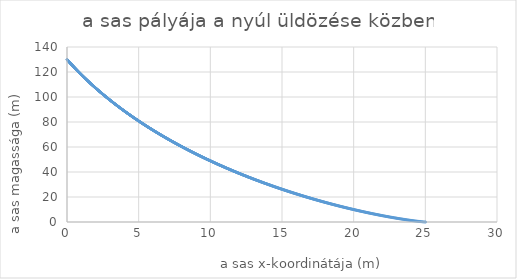
| Category | Series 0 |
|---|---|
| 0.006817466567532174 | 129.911 |
| 0.013641715062583354 | 129.823 |
| 0.020472749994992535 | 129.734 |
| 0.0273105758805344 | 129.645 |
| 0.03415519724093104 | 129.557 |
| 0.041006618603863676 | 129.468 |
| 0.04786484450298452 | 129.38 |
| 0.054729879477928525 | 129.291 |
| 0.06160172807432531 | 129.202 |
| 0.068480394843811 | 129.114 |
| 0.07536588434404017 | 129.025 |
| 0.0822582011386978 | 128.937 |
| 0.08915734979751126 | 128.848 |
| 0.09606333489626227 | 128.759 |
| 0.10297616101679902 | 128.671 |
| 0.1098958327470482 | 128.582 |
| 0.11682235468102714 | 128.493 |
| 0.12375573141885594 | 128.405 |
| 0.13069596756676966 | 128.316 |
| 0.13764306773713048 | 128.228 |
| 0.14459703654844 | 128.139 |
| 0.1515578786253515 | 128.05 |
| 0.1585255985986822 | 127.962 |
| 0.16550020110542568 | 127.873 |
| 0.17248169078876416 | 127.784 |
| 0.17947007229808098 | 127.696 |
| 0.18646535028897296 | 127.607 |
| 0.193467529423263 | 127.519 |
| 0.20047661436901243 | 127.43 |
| 0.20749260980053363 | 127.341 |
| 0.21451552039840266 | 127.253 |
| 0.22154535084947172 | 127.164 |
| 0.22858210584688188 | 127.076 |
| 0.23562579009007578 | 126.987 |
| 0.24267640828481032 | 126.898 |
| 0.2497339651431693 | 126.81 |
| 0.2567984653835764 | 126.721 |
| 0.26386991373080776 | 126.633 |
| 0.27094831491600496 | 126.544 |
| 0.2780336736766879 | 126.455 |
| 0.28512599475676775 | 126.367 |
| 0.2922252829065597 | 126.278 |
| 0.2993315428827962 | 126.19 |
| 0.3064447794486398 | 126.101 |
| 0.31356499737369636 | 126.012 |
| 0.320692201434028 | 125.924 |
| 0.32782639641216627 | 125.835 |
| 0.3349675870971253 | 125.747 |
| 0.34211577828441514 | 125.658 |
| 0.34927097477605473 | 125.569 |
| 0.35643318138058544 | 125.481 |
| 0.3636024029130841 | 125.392 |
| 0.37077864419517664 | 125.304 |
| 0.37796191005505125 | 125.215 |
| 0.38515220532747185 | 125.126 |
| 0.39234953485379165 | 125.038 |
| 0.39955390348196645 | 124.949 |
| 0.4067653160665683 | 124.861 |
| 0.41398377746879905 | 124.772 |
| 0.4212092925565039 | 124.683 |
| 0.4284418662041851 | 124.595 |
| 0.4356815032930155 | 124.506 |
| 0.4429282087108524 | 124.418 |
| 0.45018198735225134 | 124.329 |
| 0.45744284411847963 | 124.24 |
| 0.46471078391753046 | 124.152 |
| 0.4719858116641366 | 124.063 |
| 0.47926793227978437 | 123.975 |
| 0.48655715069272754 | 123.886 |
| 0.4938534718380013 | 123.797 |
| 0.5011569006574365 | 123.709 |
| 0.5084674420996731 | 123.62 |
| 0.5157851011201751 | 123.532 |
| 0.5231098826812438 | 123.443 |
| 0.530441791752033 | 123.354 |
| 0.5377808333085621 | 123.266 |
| 0.5451270123337312 | 123.177 |
| 0.552480333817335 | 123.089 |
| 0.5598408027560771 | 123 |
| 0.5672084241535845 | 122.912 |
| 0.5745832030204221 | 122.823 |
| 0.581965144374107 | 122.734 |
| 0.5893542532391228 | 122.646 |
| 0.5967505346469348 | 122.557 |
| 0.6041539936360037 | 122.469 |
| 0.6115646352518009 | 122.38 |
| 0.6189824645468228 | 122.291 |
| 0.6264074865806056 | 122.203 |
| 0.63383970641974 | 122.114 |
| 0.641279129137886 | 122.026 |
| 0.6487257598157877 | 121.937 |
| 0.6561796035412882 | 121.849 |
| 0.6636406654093446 | 121.76 |
| 0.6711089505220426 | 121.671 |
| 0.6785844639886117 | 121.583 |
| 0.6860672109254404 | 121.494 |
| 0.6935571964560912 | 121.406 |
| 0.701054425711315 | 121.317 |
| 0.7085589038290677 | 121.229 |
| 0.7160706359545239 | 121.14 |
| 0.7235896272400931 | 121.051 |
| 0.7311158828454346 | 120.963 |
| 0.7386494079374729 | 120.874 |
| 0.7461902076904132 | 120.786 |
| 0.7537382872857565 | 120.697 |
| 0.7612936519123154 | 120.609 |
| 0.7688563067662291 | 120.52 |
| 0.7764262570509798 | 120.431 |
| 0.7840035079774074 | 120.343 |
| 0.7915880647637256 | 120.254 |
| 0.7991799326355374 | 120.166 |
| 0.8067791168258511 | 120.077 |
| 0.8143856225750957 | 119.989 |
| 0.821999455131137 | 119.9 |
| 0.8296206197492931 | 119.812 |
| 0.8372491216923508 | 119.723 |
| 0.844884966230581 | 119.634 |
| 0.8525281586417551 | 119.546 |
| 0.8601787042111612 | 119.457 |
| 0.8678366082316192 | 119.369 |
| 0.8755018760034984 | 119.28 |
| 0.8831745128347321 | 119.192 |
| 0.8908545240408353 | 119.103 |
| 0.8985419149449199 | 119.015 |
| 0.9062366908777113 | 118.926 |
| 0.9139388571775652 | 118.837 |
| 0.9216484191904833 | 118.749 |
| 0.9293653822701305 | 118.66 |
| 0.9370897517778507 | 118.572 |
| 0.9448215330826838 | 118.483 |
| 0.9525607315613821 | 118.395 |
| 0.960307352598427 | 118.306 |
| 0.9680614015860458 | 118.218 |
| 0.9758228839242283 | 118.129 |
| 0.9835918050207436 | 118.04 |
| 0.991368170291157 | 117.952 |
| 0.9991519851588467 | 117.863 |
| 1.0069432550550212 | 117.775 |
| 1.014741985418736 | 117.686 |
| 1.0225481816969102 | 117.598 |
| 1.0303618493443443 | 117.509 |
| 1.038182993823737 | 117.421 |
| 1.0460116206057024 | 117.332 |
| 1.0538477351687872 | 117.244 |
| 1.061691342999488 | 117.155 |
| 1.0695424495922692 | 117.066 |
| 1.077401060449579 | 116.978 |
| 1.085267181081868 | 116.889 |
| 1.0931408170076065 | 116.801 |
| 1.101021973753302 | 116.712 |
| 1.1089106568535165 | 116.624 |
| 1.1168068718508846 | 116.535 |
| 1.1247106242961304 | 116.447 |
| 1.1326219197480862 | 116.358 |
| 1.1405407637737097 | 116.27 |
| 1.1484671619481022 | 116.181 |
| 1.156401119854526 | 116.093 |
| 1.1643426430844233 | 116.004 |
| 1.1722917372374326 | 115.915 |
| 1.1802484079214084 | 115.827 |
| 1.1882126607524386 | 115.738 |
| 1.1961845013548624 | 115.65 |
| 1.2041639353612892 | 115.561 |
| 1.2121509684126162 | 115.473 |
| 1.2201456061580471 | 115.384 |
| 1.2281478542551105 | 115.296 |
| 1.2361577183696781 | 115.207 |
| 1.2441752041759835 | 115.119 |
| 1.2522003173566403 | 115.03 |
| 1.260233063602661 | 114.942 |
| 1.2682734486134761 | 114.853 |
| 1.2763214780969516 | 114.765 |
| 1.284377157769409 | 114.676 |
| 1.2924404933556433 | 114.588 |
| 1.3005114905889426 | 114.499 |
| 1.308590155211106 | 114.411 |
| 1.3166764929724641 | 114.322 |
| 1.3247705096318962 | 114.233 |
| 1.332872210956851 | 114.145 |
| 1.3409816027233648 | 114.056 |
| 1.3490986907160811 | 113.968 |
| 1.35722348072827 | 113.879 |
| 1.365355978561847 | 113.791 |
| 1.3734961900273932 | 113.702 |
| 1.3816441209441739 | 113.614 |
| 1.3897997771401587 | 113.525 |
| 1.3979631644520407 | 113.437 |
| 1.4061342887252564 | 113.348 |
| 1.414313155814005 | 113.26 |
| 1.4224997715812686 | 113.171 |
| 1.430694141898832 | 113.083 |
| 1.438896272647302 | 112.994 |
| 1.4471061697161278 | 112.906 |
| 1.4553238390036212 | 112.817 |
| 1.4635492864169757 | 112.729 |
| 1.4717825178722876 | 112.64 |
| 1.480023539294576 | 112.552 |
| 1.4882723566178022 | 112.463 |
| 1.496528975784891 | 112.375 |
| 1.5047934027477503 | 112.286 |
| 1.5130656434672922 | 112.198 |
| 1.521345703913453 | 112.109 |
| 1.5296335900652138 | 112.021 |
| 1.537929307910621 | 111.932 |
| 1.5462328634468077 | 111.844 |
| 1.5545442626800128 | 111.755 |
| 1.5628635116256036 | 111.667 |
| 1.5711906163080953 | 111.578 |
| 1.5795255827611732 | 111.49 |
| 1.5878684170277122 | 111.401 |
| 1.596219125159799 | 111.313 |
| 1.6045777132187524 | 111.224 |
| 1.6129441872751453 | 111.136 |
| 1.6213185534088252 | 111.047 |
| 1.6297008177089358 | 110.959 |
| 1.6380909862739383 | 110.87 |
| 1.646489065211633 | 110.782 |
| 1.6548950606391806 | 110.693 |
| 1.6633089786831237 | 110.605 |
| 1.6717308254794088 | 110.516 |
| 1.6801606071734074 | 110.428 |
| 1.6885983299199385 | 110.339 |
| 1.6970439998832898 | 110.251 |
| 1.7054976232372399 | 110.162 |
| 1.7139592061650801 | 110.074 |
| 1.7224287548596366 | 109.985 |
| 1.7309062755232927 | 109.897 |
| 1.7393917743680103 | 109.808 |
| 1.7478852576153532 | 109.72 |
| 1.7563867314965083 | 109.631 |
| 1.764896202252309 | 109.543 |
| 1.7734136761332568 | 109.454 |
| 1.7819391593995444 | 109.366 |
| 1.790472658321078 | 109.278 |
| 1.7990141791774998 | 109.189 |
| 1.8075637282582113 | 109.101 |
| 1.8161213118623953 | 109.012 |
| 1.8246869362990394 | 108.924 |
| 1.833260607886959 | 108.835 |
| 1.8418423329548197 | 108.747 |
| 1.8504321178411607 | 108.658 |
| 1.8590299688944183 | 108.57 |
| 1.8676358924729484 | 108.481 |
| 1.8762498949450506 | 108.393 |
| 1.884871982688991 | 108.304 |
| 1.893502162093026 | 108.216 |
| 1.902140439555425 | 108.127 |
| 1.9107868214844959 | 108.039 |
| 1.919441314298606 | 107.95 |
| 1.9281039244262086 | 107.862 |
| 1.9367746583058647 | 107.774 |
| 1.945453522386268 | 107.685 |
| 1.9541405231262683 | 107.597 |
| 1.962835666994896 | 107.508 |
| 1.971538960471386 | 107.42 |
| 1.9802504100452016 | 107.331 |
| 1.9889700222160598 | 107.243 |
| 1.997697803493954 | 107.154 |
| 2.0064337603991804 | 107.066 |
| 2.01517789946236 | 106.977 |
| 2.0239302272244664 | 106.889 |
| 2.0326907502368474 | 106.8 |
| 2.041459475061252 | 106.712 |
| 2.0502364082698534 | 106.624 |
| 2.0590215564452756 | 106.535 |
| 2.067814926180617 | 106.447 |
| 2.076616524079476 | 106.358 |
| 2.085426356755976 | 106.27 |
| 2.0942444308347916 | 106.181 |
| 2.1030707529511727 | 106.093 |
| 2.11190532975097 | 106.004 |
| 2.1207481678906603 | 105.916 |
| 2.129599274037374 | 105.827 |
| 2.1384586548689173 | 105.739 |
| 2.1473263170738015 | 105.651 |
| 2.156202267351266 | 105.562 |
| 2.165086512411305 | 105.474 |
| 2.173979058974695 | 105.385 |
| 2.182879913773019 | 105.297 |
| 2.191789083548692 | 105.208 |
| 2.2007065750549906 | 105.12 |
| 2.2096323950560754 | 105.032 |
| 2.2185665503270195 | 104.943 |
| 2.227509047653835 | 104.855 |
| 2.2364598938334987 | 104.766 |
| 2.245419095673979 | 104.678 |
| 2.254386659994263 | 104.589 |
| 2.2633625936243833 | 104.501 |
| 2.272346903405444 | 104.412 |
| 2.2813395961896488 | 104.324 |
| 2.290340678840328 | 104.236 |
| 2.2993501582319644 | 104.147 |
| 2.308368041250222 | 104.059 |
| 2.317394334791973 | 103.97 |
| 2.3264290457653245 | 103.882 |
| 2.3354721810896466 | 103.793 |
| 2.3445237476956002 | 103.705 |
| 2.3535837525251644 | 103.617 |
| 2.362652202531664 | 103.528 |
| 2.3717291046797984 | 103.44 |
| 2.380814465945668 | 103.351 |
| 2.3899082933168034 | 103.263 |
| 2.399010593792194 | 103.174 |
| 2.4081213743823153 | 103.086 |
| 2.417240642109157 | 102.998 |
| 2.426368404006252 | 102.909 |
| 2.435504667118705 | 102.821 |
| 2.4446494385032214 | 102.732 |
| 2.4538027252281354 | 102.644 |
| 2.4629645343734388 | 102.556 |
| 2.47213487303081 | 102.467 |
| 2.4813137483036436 | 102.379 |
| 2.490501167307079 | 102.29 |
| 2.4996971371680297 | 102.202 |
| 2.508901665025212 | 102.113 |
| 2.5181147580291756 | 102.025 |
| 2.5273364233423323 | 101.937 |
| 2.536566668138985 | 101.848 |
| 2.5458054996053594 | 101.76 |
| 2.5550529249396314 | 101.671 |
| 2.564308951351959 | 101.583 |
| 2.5735735860645104 | 101.495 |
| 2.5828468363114956 | 101.406 |
| 2.592128709339196 | 101.318 |
| 2.6014192124059954 | 101.229 |
| 2.6107183527824085 | 101.141 |
| 2.6200261377511134 | 101.053 |
| 2.629342574606981 | 100.964 |
| 2.6386676706571066 | 100.876 |
| 2.64800143322084 | 100.787 |
| 2.6573438696298166 | 100.699 |
| 2.6666949872279884 | 100.611 |
| 2.6760547933716556 | 100.522 |
| 2.6854232954294965 | 100.434 |
| 2.6948005007826006 | 100.345 |
| 2.704186416824499 | 100.257 |
| 2.7135810509611953 | 100.169 |
| 2.7229844106111987 | 100.08 |
| 2.732396503205555 | 99.992 |
| 2.7418173361878786 | 99.904 |
| 2.7512469170143845 | 99.815 |
| 2.7606852531539197 | 99.727 |
| 2.7701323520879964 | 99.638 |
| 2.7795882213108234 | 99.55 |
| 2.78905286832934 | 99.462 |
| 2.798526300663246 | 99.373 |
| 2.808008525845038 | 99.285 |
| 2.8174995514200374 | 99.196 |
| 2.8269993849464274 | 99.108 |
| 2.836508033995284 | 99.02 |
| 2.8460255061506095 | 98.931 |
| 2.855551809009365 | 98.843 |
| 2.8650869501815057 | 98.755 |
| 2.8746309372900116 | 98.666 |
| 2.884183777970923 | 98.578 |
| 2.8937454798733735 | 98.489 |
| 2.903316050659624 | 98.401 |
| 2.9128954980050956 | 98.313 |
| 2.9224838295984057 | 98.224 |
| 2.9320810531414 | 98.136 |
| 2.9416871763491867 | 98.048 |
| 2.9513022069501735 | 97.959 |
| 2.960926152686099 | 97.871 |
| 2.970559021312069 | 97.782 |
| 2.9802008205965906 | 97.694 |
| 2.9898515583216074 | 97.606 |
| 2.9995112422825336 | 97.517 |
| 3.0091798802882908 | 97.429 |
| 3.0188574801613415 | 97.341 |
| 3.0285440497377247 | 97.252 |
| 3.038239596867092 | 97.164 |
| 3.0479441294127434 | 97.076 |
| 3.0576576552516617 | 96.987 |
| 3.0673801822745492 | 96.899 |
| 3.0771117183858636 | 96.811 |
| 3.086852271503854 | 96.722 |
| 3.096601849560597 | 96.634 |
| 3.1063604605020334 | 96.545 |
| 3.1161281122880036 | 96.457 |
| 3.125904812892285 | 96.369 |
| 3.135690570302629 | 96.28 |
| 3.1454853925207975 | 96.192 |
| 3.1552892875625993 | 96.104 |
| 3.1651022634579284 | 96.015 |
| 3.1749243282507997 | 95.927 |
| 3.1847554899993877 | 95.839 |
| 3.1945957567760632 | 95.75 |
| 3.2044451366674314 | 95.662 |
| 3.214303637774369 | 95.574 |
| 3.2241712682120633 | 95.485 |
| 3.2340480361100488 | 95.397 |
| 3.2439339496122463 | 95.309 |
| 3.2538290168770008 | 95.22 |
| 3.2637332460771193 | 95.132 |
| 3.2736466453999116 | 95.044 |
| 3.2835692230472264 | 94.955 |
| 3.2935009872354915 | 94.867 |
| 3.3034419461957527 | 94.779 |
| 3.3133921081737125 | 94.69 |
| 3.32335148142977 | 94.602 |
| 3.3333200742390594 | 94.514 |
| 3.34329789489149 | 94.425 |
| 3.3532849516917866 | 94.337 |
| 3.363281252959528 | 94.249 |
| 3.373286807029188 | 94.16 |
| 3.3833016222501753 | 94.072 |
| 3.393325706986873 | 93.984 |
| 3.40335906961868 | 93.895 |
| 3.4134017185400514 | 93.807 |
| 3.4234536621605383 | 93.719 |
| 3.43351490890483 | 93.63 |
| 3.4435854672127935 | 93.542 |
| 3.4536653455395165 | 93.454 |
| 3.463754552355347 | 93.365 |
| 3.4738530961459353 | 93.277 |
| 3.4839609854122755 | 93.189 |
| 3.494078228670748 | 93.101 |
| 3.5042048344531604 | 93.012 |
| 3.5143408113067895 | 92.924 |
| 3.524486167794425 | 92.836 |
| 3.53464091249441 | 92.747 |
| 3.5448050540006837 | 92.659 |
| 3.5549786009228264 | 92.571 |
| 3.5651615618860992 | 92.482 |
| 3.5753539455314884 | 92.394 |
| 3.5855557605157493 | 92.306 |
| 3.595767015511448 | 92.217 |
| 3.6059877192070062 | 92.129 |
| 3.616217880306744 | 92.041 |
| 3.626457507530924 | 91.953 |
| 3.636706609615795 | 91.864 |
| 3.6469651953136357 | 91.776 |
| 3.6572332733928006 | 91.688 |
| 3.667510852637762 | 91.599 |
| 3.6777979418491578 | 91.511 |
| 3.688094549843832 | 91.423 |
| 3.698400685454883 | 91.335 |
| 3.7087163575317086 | 91.246 |
| 3.7190415749400487 | 91.158 |
| 3.729376346562033 | 91.07 |
| 3.739720681296226 | 90.981 |
| 3.750074588057672 | 90.893 |
| 3.7604380757779423 | 90.805 |
| 3.7708111534051802 | 90.717 |
| 3.7811938299041485 | 90.628 |
| 3.7915861142562743 | 90.54 |
| 3.8019880154596963 | 90.452 |
| 3.8123995425293127 | 90.363 |
| 3.8228207044968268 | 90.275 |
| 3.8332515104107943 | 90.187 |
| 3.8436919693366707 | 90.099 |
| 3.8541420903568597 | 90.01 |
| 3.86460188257076 | 89.922 |
| 3.875071355094813 | 89.834 |
| 3.885550517062551 | 89.746 |
| 3.8960393776246454 | 89.657 |
| 3.906537945948956 | 89.569 |
| 3.9170462312205787 | 89.481 |
| 3.9275642426418935 | 89.392 |
| 3.9380919894326154 | 89.304 |
| 3.9486294808298417 | 89.216 |
| 3.9591767260881023 | 89.128 |
| 3.969733734479409 | 89.039 |
| 3.9803005152933055 | 88.951 |
| 3.9908770778369167 | 88.863 |
| 4.001463431434999 | 88.775 |
| 4.0120595854299905 | 88.686 |
| 4.0226655491820615 | 88.598 |
| 4.033281332069165 | 88.51 |
| 4.043906943487088 | 88.422 |
| 4.054542392849504 | 88.333 |
| 4.065187689588019 | 88.245 |
| 4.075842843152229 | 88.157 |
| 4.086507863009768 | 88.069 |
| 4.097182758646362 | 87.98 |
| 4.107867539565879 | 87.892 |
| 4.118562215290382 | 87.804 |
| 4.129266795360182 | 87.716 |
| 4.139981289333889 | 87.627 |
| 4.150705706788468 | 87.539 |
| 4.16144005731929 | 87.451 |
| 4.172184350540181 | 87.363 |
| 4.182938596083487 | 87.274 |
| 4.193702803600114 | 87.186 |
| 4.204476982759591 | 87.098 |
| 4.21526114325012 | 87.01 |
| 4.226055294778634 | 86.922 |
| 4.236859447070847 | 86.833 |
| 4.247673609871311 | 86.745 |
| 4.25849779294347 | 86.657 |
| 4.269332006069719 | 86.569 |
| 4.280176259051452 | 86.48 |
| 4.291030561709125 | 86.392 |
| 4.301894923882306 | 86.304 |
| 4.312769355429734 | 86.216 |
| 4.323653866229376 | 86.128 |
| 4.334548466178482 | 86.039 |
| 4.34545316519364 | 85.951 |
| 4.356367973210836 | 85.863 |
| 4.367292900185509 | 85.775 |
| 4.37822795609261 | 85.686 |
| 4.389173150926659 | 85.598 |
| 4.400128494701801 | 85.51 |
| 4.411093997451865 | 85.422 |
| 4.422069669230425 | 85.334 |
| 4.433055520110855 | 85.245 |
| 4.444051560186389 | 85.157 |
| 4.455057799570178 | 85.069 |
| 4.466074248395353 | 84.981 |
| 4.477100916815083 | 84.893 |
| 4.488137815002631 | 84.804 |
| 4.49918495315142 | 84.716 |
| 4.510242341475087 | 84.628 |
| 4.52130999020755 | 84.54 |
| 4.532387909603062 | 84.452 |
| 4.543476109936275 | 84.363 |
| 4.554574601502302 | 84.275 |
| 4.5656833946167765 | 84.187 |
| 4.576802499615915 | 84.099 |
| 4.587931926856578 | 84.011 |
| 4.599071686716334 | 83.922 |
| 4.610221789593519 | 83.834 |
| 4.6213822459073 | 83.746 |
| 4.632553066097742 | 83.658 |
| 4.643734260625863 | 83.57 |
| 4.654925839973704 | 83.482 |
| 4.6661278146443905 | 83.393 |
| 4.677340195162195 | 83.305 |
| 4.688562992072602 | 83.217 |
| 4.699796215942375 | 83.129 |
| 4.7110398773596165 | 83.041 |
| 4.7222939869338365 | 82.952 |
| 4.733558555296015 | 82.864 |
| 4.74483359309867 | 82.776 |
| 4.756119111015921 | 82.688 |
| 4.767415119743556 | 82.6 |
| 4.778721629999099 | 82.512 |
| 4.790038652521873 | 82.423 |
| 4.80136619807307 | 82.335 |
| 4.812704277435816 | 82.247 |
| 4.824052901415239 | 82.159 |
| 4.835412080838539 | 82.071 |
| 4.846781826555051 | 81.983 |
| 4.858162149436317 | 81.894 |
| 4.869553060376152 | 81.806 |
| 4.880954570290716 | 81.718 |
| 4.892366690118579 | 81.63 |
| 4.903789430820794 | 81.542 |
| 4.915222803380963 | 81.454 |
| 4.926666818805308 | 81.366 |
| 4.938121488122745 | 81.277 |
| 4.949586822384947 | 81.189 |
| 4.961062832666422 | 81.101 |
| 4.97254953006458 | 81.013 |
| 4.984046925699803 | 80.925 |
| 4.995555030715523 | 80.837 |
| 5.007073856278287 | 80.749 |
| 5.01860341357783 | 80.66 |
| 5.0301437138271545 | 80.572 |
| 5.0416947682625946 | 80.484 |
| 5.053256588143894 | 80.396 |
| 5.064829184754276 | 80.308 |
| 5.0764125694005235 | 80.22 |
| 5.088006753413046 | 80.132 |
| 5.099611748145957 | 80.043 |
| 5.111227564977151 | 79.955 |
| 5.122854215308372 | 79.867 |
| 5.134491710565297 | 79.779 |
| 5.146140062197604 | 79.691 |
| 5.157799281679054 | 79.603 |
| 5.1694693805075635 | 79.515 |
| 5.181150370205283 | 79.427 |
| 5.192842262318672 | 79.339 |
| 5.204545068418579 | 79.25 |
| 5.216258800100315 | 79.162 |
| 5.227983468983736 | 79.074 |
| 5.239719086713319 | 78.986 |
| 5.25146566495824 | 78.898 |
| 5.263223215412453 | 78.81 |
| 5.274991749794771 | 78.722 |
| 5.286771279848944 | 78.634 |
| 5.298561817343738 | 78.546 |
| 5.310363374073018 | 78.457 |
| 5.322175961855826 | 78.369 |
| 5.333999592536464 | 78.281 |
| 5.345834277984574 | 78.193 |
| 5.35768003009522 | 78.105 |
| 5.369536860788969 | 78.017 |
| 5.381404782011976 | 77.929 |
| 5.393283805736063 | 77.841 |
| 5.405173943958807 | 77.753 |
| 5.417075208703617 | 77.665 |
| 5.4289876120198235 | 77.576 |
| 5.44091116598276 | 77.488 |
| 5.452845882693848 | 77.4 |
| 5.464791774280681 | 77.312 |
| 5.476748852897112 | 77.224 |
| 5.488717130723336 | 77.136 |
| 5.500696619965979 | 77.048 |
| 5.5126873328581825 | 76.96 |
| 5.5246892816596915 | 76.872 |
| 5.53670247865694 | 76.784 |
| 5.548726936163139 | 76.696 |
| 5.560762666518367 | 76.608 |
| 5.5728096820896535 | 76.52 |
| 5.584867995271072 | 76.431 |
| 5.596937618483826 | 76.343 |
| 5.609018564176343 | 76.255 |
| 5.621110844824356 | 76.167 |
| 5.633214472931003 | 76.079 |
| 5.645329461026912 | 75.991 |
| 5.657455821670293 | 75.903 |
| 5.669593567447032 | 75.815 |
| 5.681742710970779 | 75.727 |
| 5.693903264883042 | 75.639 |
| 5.706075241853282 | 75.551 |
| 5.718258654579 | 75.463 |
| 5.73045351578584 | 75.375 |
| 5.742659838227671 | 75.287 |
| 5.754877634686693 | 75.199 |
| 5.767106917973523 | 75.111 |
| 5.779347700927294 | 75.023 |
| 5.791599996415752 | 74.935 |
| 5.8038638173353485 | 74.847 |
| 5.8161391766113395 | 74.759 |
| 5.82842608719788 | 74.67 |
| 5.840724562078126 | 74.582 |
| 5.853034614264327 | 74.494 |
| 5.865356256797925 | 74.406 |
| 5.877689502749659 | 74.318 |
| 5.890034365219655 | 74.23 |
| 5.902390857337535 | 74.142 |
| 5.914758992262507 | 74.054 |
| 5.927138783183474 | 73.966 |
| 5.9395302433191315 | 73.878 |
| 5.9519333859180685 | 73.79 |
| 5.9643482242588695 | 73.702 |
| 5.976774771650218 | 73.614 |
| 5.989213041430998 | 73.526 |
| 6.001663046970397 | 73.438 |
| 6.014124801668012 | 73.35 |
| 6.026598318953951 | 73.262 |
| 6.039083612288939 | 73.174 |
| 6.051580695164422 | 73.086 |
| 6.064089581102676 | 72.998 |
| 6.076610283656908 | 72.91 |
| 6.089142816411367 | 72.822 |
| 6.101687192981448 | 72.734 |
| 6.114243427013801 | 72.646 |
| 6.126811532186442 | 72.558 |
| 6.139391522208854 | 72.47 |
| 6.151983410822104 | 72.382 |
| 6.164587211798949 | 72.294 |
| 6.177202938943946 | 72.206 |
| 6.189830606093562 | 72.118 |
| 6.2024702271162875 | 72.03 |
| 6.215121815912747 | 71.942 |
| 6.22778538641581 | 71.854 |
| 6.240460952590706 | 71.766 |
| 6.253148528435136 | 71.678 |
| 6.265848127979385 | 71.59 |
| 6.278559765286442 | 71.502 |
| 6.291283454452106 | 71.414 |
| 6.30401920960511 | 71.326 |
| 6.316767044907232 | 71.238 |
| 6.329526974553413 | 71.15 |
| 6.34229901277187 | 71.062 |
| 6.355083173824224 | 70.974 |
| 6.367879472005605 | 70.887 |
| 6.38068792164478 | 70.799 |
| 6.393508537104268 | 70.711 |
| 6.406341332780463 | 70.623 |
| 6.41918632310375 | 70.535 |
| 6.432043522538629 | 70.447 |
| 6.444912945583838 | 70.359 |
| 6.457794606772469 | 70.271 |
| 6.470688520672098 | 70.183 |
| 6.483594701884903 | 70.095 |
| 6.496513165047791 | 70.007 |
| 6.509443924832519 | 69.919 |
| 6.5223869959458245 | 69.831 |
| 6.535342393129546 | 69.743 |
| 6.548310131160751 | 69.655 |
| 6.561290224851864 | 69.567 |
| 6.574282689050792 | 69.479 |
| 6.587287538641054 | 69.391 |
| 6.600304788541911 | 69.303 |
| 6.613334453708491 | 69.216 |
| 6.626376549131923 | 69.128 |
| 6.639431089839466 | 69.04 |
| 6.65249809089464 | 68.952 |
| 6.665577567397359 | 68.864 |
| 6.6786695344840625 | 68.776 |
| 6.691774007327849 | 68.688 |
| 6.70489100113861 | 68.6 |
| 6.718020531163164 | 68.512 |
| 6.731162612685392 | 68.424 |
| 6.744317261026372 | 68.336 |
| 6.757484491544518 | 68.248 |
| 6.770664319635715 | 68.161 |
| 6.783856760733459 | 68.073 |
| 6.797061830308991 | 67.985 |
| 6.810279543871441 | 67.897 |
| 6.823509916967965 | 67.809 |
| 6.836752965183887 | 67.721 |
| 6.85000870414284 | 67.633 |
| 6.8632771495069065 | 67.545 |
| 6.876558316976763 | 67.457 |
| 6.8898522222918235 | 67.369 |
| 6.90315888123038 | 67.282 |
| 6.916478309609751 | 67.194 |
| 6.929810523286426 | 67.106 |
| 6.943155538156213 | 67.018 |
| 6.95651337015438 | 66.93 |
| 6.969884035255811 | 66.842 |
| 6.983267549475147 | 66.754 |
| 6.99666392886694 | 66.666 |
| 7.0100731895258 | 66.579 |
| 7.023495347586547 | 66.491 |
| 7.036930419224363 | 66.403 |
| 7.050378420654942 | 66.315 |
| 7.063839368134647 | 66.227 |
| 7.077313277960658 | 66.139 |
| 7.090800166471131 | 66.051 |
| 7.104300050045351 | 65.964 |
| 7.117812945103891 | 65.876 |
| 7.131338868108765 | 65.788 |
| 7.144877835563587 | 65.7 |
| 7.1584298640137325 | 65.612 |
| 7.171994970046493 | 65.524 |
| 7.185573170291239 | 65.436 |
| 7.199164481419579 | 65.349 |
| 7.2127689201455265 | 65.261 |
| 7.226386503225654 | 65.173 |
| 7.240017247459263 | 65.085 |
| 7.253661169688546 | 64.997 |
| 7.267318286798752 | 64.909 |
| 7.2809886157183525 | 64.822 |
| 7.294672173419206 | 64.734 |
| 7.308368976916731 | 64.646 |
| 7.322079043270069 | 64.558 |
| 7.3358023895822555 | 64.47 |
| 7.349539033000393 | 64.382 |
| 7.363288990715818 | 64.295 |
| 7.377052279964277 | 64.207 |
| 7.390828918026095 | 64.119 |
| 7.404618922226355 | 64.031 |
| 7.4184223099350675 | 63.943 |
| 7.432239098567349 | 63.856 |
| 7.446069305583597 | 63.768 |
| 7.45991294848967 | 63.68 |
| 7.473770044837064 | 63.592 |
| 7.487640612223091 | 63.504 |
| 7.5015246682910615 | 63.417 |
| 7.515422230730465 | 63.329 |
| 7.5293333172771515 | 63.241 |
| 7.543257945713516 | 63.153 |
| 7.557196133868682 | 63.065 |
| 7.571147899618685 | 62.978 |
| 7.585113260886664 | 62.89 |
| 7.599092235643041 | 62.802 |
| 7.613084841905714 | 62.714 |
| 7.627091097740246 | 62.626 |
| 7.641111021260055 | 62.539 |
| 7.655144630626601 | 62.451 |
| 7.669191944049585 | 62.363 |
| 7.683252979787138 | 62.275 |
| 7.697327756146015 | 62.188 |
| 7.711416291481791 | 62.1 |
| 7.72551860419906 | 62.012 |
| 7.739634712751627 | 61.924 |
| 7.753764635642711 | 61.837 |
| 7.767908391425143 | 61.749 |
| 7.782065998701566 | 61.661 |
| 7.796237476124637 | 61.573 |
| 7.81042284239723 | 61.486 |
| 7.824622116272641 | 61.398 |
| 7.838835316554791 | 61.31 |
| 7.853062462098432 | 61.222 |
| 7.867303571809357 | 61.135 |
| 7.881558664644605 | 61.047 |
| 7.895827759612674 | 60.959 |
| 7.910110875773728 | 60.871 |
| 7.9244080322398105 | 60.784 |
| 7.938719248175058 | 60.696 |
| 7.953044542795914 | 60.608 |
| 7.967383935371343 | 60.52 |
| 7.9817374452230485 | 60.433 |
| 7.996105091725689 | 60.345 |
| 8.0104868943071 | 60.257 |
| 8.024882872448512 | 60.17 |
| 8.039293045684769 | 60.082 |
| 8.053717433604556 | 59.994 |
| 8.068156055850622 | 59.906 |
| 8.082608932120003 | 59.819 |
| 8.097076082164248 | 59.731 |
| 8.11155752578965 | 59.643 |
| 8.126053282857468 | 59.556 |
| 8.140563373284168 | 59.468 |
| 8.155087817041645 | 59.38 |
| 8.169626634157456 | 59.293 |
| 8.184179844715063 | 59.205 |
| 8.198747468854055 | 59.117 |
| 8.2133295267704 | 59.029 |
| 8.227926038716667 | 58.942 |
| 8.242537025002278 | 58.854 |
| 8.257162505993742 | 58.766 |
| 8.2718025021149 | 58.679 |
| 8.286457033847167 | 58.591 |
| 8.301126121729778 | 58.503 |
| 8.315809786360031 | 58.416 |
| 8.330508048393538 | 58.328 |
| 8.345220928544475 | 58.24 |
| 8.359948447585829 | 58.153 |
| 8.374690626349652 | 58.065 |
| 8.389447485727313 | 57.977 |
| 8.404219046669755 | 57.89 |
| 8.41900533018775 | 57.802 |
| 8.433806357352152 | 57.715 |
| 8.448622149294168 | 57.627 |
| 8.463452727205608 | 57.539 |
| 8.47829811233915 | 57.452 |
| 8.493158326008608 | 57.364 |
| 8.50803338958919 | 57.276 |
| 8.522923324517771 | 57.189 |
| 8.537828152293159 | 57.101 |
| 8.552747894476363 | 57.013 |
| 8.56768257269087 | 56.926 |
| 8.582632208622913 | 56.838 |
| 8.597596824021746 | 56.751 |
| 8.612576440699925 | 56.663 |
| 8.627571080533581 | 56.575 |
| 8.642580765462702 | 56.488 |
| 8.657605517491413 | 56.4 |
| 8.67264535868826 | 56.312 |
| 8.687700311186493 | 56.225 |
| 8.702770397184354 | 56.137 |
| 8.717855638945364 | 56.05 |
| 8.732956058798615 | 55.962 |
| 8.748071679139056 | 55.874 |
| 8.763202522427791 | 55.787 |
| 8.778348611192374 | 55.699 |
| 8.7935099680271 | 55.612 |
| 8.808686615593311 | 55.524 |
| 8.823878576619691 | 55.437 |
| 8.839085873902569 | 55.349 |
| 8.854308530306225 | 55.261 |
| 8.869546568763193 | 55.174 |
| 8.884800012274567 | 55.086 |
| 8.900068883910318 | 54.999 |
| 8.915353206809597 | 54.911 |
| 8.930653004181048 | 54.824 |
| 8.945968299303132 | 54.736 |
| 8.961299115524435 | 54.648 |
| 8.976645476263988 | 54.561 |
| 8.992007405011591 | 54.473 |
| 9.007384925328138 | 54.386 |
| 9.022778060845932 | 54.298 |
| 9.03818683526902 | 54.211 |
| 9.053611272373521 | 54.123 |
| 9.069051396007954 | 54.036 |
| 9.08450723009357 | 53.948 |
| 9.09997879862469 | 53.861 |
| 9.115466125669041 | 53.773 |
| 9.130969235368093 | 53.685 |
| 9.146488151937403 | 53.598 |
| 9.162022899666953 | 53.51 |
| 9.177573502921504 | 53.423 |
| 9.193139986140935 | 53.335 |
| 9.208722373840596 | 53.248 |
| 9.22432069061166 | 53.16 |
| 9.23993496112148 | 53.073 |
| 9.255565210113932 | 52.985 |
| 9.271211462409795 | 52.898 |
| 9.286873742907092 | 52.81 |
| 9.302552076581463 | 52.723 |
| 9.318246488486528 | 52.635 |
| 9.333957003754255 | 52.548 |
| 9.349683647595329 | 52.46 |
| 9.365426445299523 | 52.373 |
| 9.381185422236076 | 52.285 |
| 9.396960603854065 | 52.198 |
| 9.412752015682793 | 52.111 |
| 9.428559683332159 | 52.023 |
| 9.444383632493052 | 51.936 |
| 9.460223888937731 | 51.848 |
| 9.476080478520219 | 51.761 |
| 9.49195342717669 | 51.673 |
| 9.507842760925868 | 51.586 |
| 9.52374850586942 | 51.498 |
| 9.539670688192357 | 51.411 |
| 9.555609334163433 | 51.323 |
| 9.571564470135554 | 51.236 |
| 9.587536122546181 | 51.148 |
| 9.603524317917742 | 51.061 |
| 9.619529082858042 | 50.974 |
| 9.63555044406068 | 50.886 |
| 9.651588428305466 | 50.799 |
| 9.66764306245884 | 50.711 |
| 9.683714373474297 | 50.624 |
| 9.699802388392815 | 50.536 |
| 9.715907134343277 | 50.449 |
| 9.732028638542909 | 50.362 |
| 9.74816692829771 | 50.274 |
| 9.764322031002893 | 50.187 |
| 9.78049397414332 | 50.099 |
| 9.796682785293955 | 50.012 |
| 9.812888492120294 | 49.925 |
| 9.82911112237883 | 49.837 |
| 9.845350703917493 | 49.75 |
| 9.861607264676113 | 49.662 |
| 9.877880832686875 | 49.575 |
| 9.894171436074778 | 49.488 |
| 9.910479103058101 | 49.4 |
| 9.92680386194887 | 49.313 |
| 9.943145741153327 | 49.226 |
| 9.959504769172408 | 49.138 |
| 9.975880974602214 | 49.051 |
| 9.992274386134495 | 48.963 |
| 10.008685032557128 | 48.876 |
| 10.02511294275461 | 48.789 |
| 10.041558145708544 | 48.701 |
| 10.05802067049813 | 48.614 |
| 10.07450054630067 | 48.527 |
| 10.090997802392051 | 48.439 |
| 10.107512468147272 | 48.352 |
| 10.124044573040928 | 48.265 |
| 10.140594146647732 | 48.177 |
| 10.15716121864303 | 48.09 |
| 10.173745818803308 | 48.003 |
| 10.190347977006725 | 47.915 |
| 10.206967723233626 | 47.828 |
| 10.22360508756708 | 47.741 |
| 10.240260100193405 | 47.653 |
| 10.256932791402702 | 47.566 |
| 10.273623191589403 | 47.479 |
| 10.290331331252803 | 47.391 |
| 10.307057240997615 | 47.304 |
| 10.323800951534514 | 47.217 |
| 10.340562493680693 | 47.13 |
| 10.357341898360424 | 47.042 |
| 10.374139196605618 | 46.955 |
| 10.390954419556392 | 46.868 |
| 10.407787598461635 | 46.78 |
| 10.424638764679587 | 46.693 |
| 10.441507949678412 | 46.606 |
| 10.458395185036787 | 46.519 |
| 10.475300502444481 | 46.431 |
| 10.492223933702952 | 46.344 |
| 10.509165510725936 | 46.257 |
| 10.526125265540045 | 46.17 |
| 10.543103230285382 | 46.082 |
| 10.560099437216131 | 45.995 |
| 10.577113918701183 | 45.908 |
| 10.594146707224747 | 45.821 |
| 10.611197835386967 | 45.733 |
| 10.628267335904555 | 45.646 |
| 10.645355241611414 | 45.559 |
| 10.662461585459274 | 45.472 |
| 10.679586400518335 | 45.384 |
| 10.696729719977906 | 45.297 |
| 10.713891577147054 | 45.21 |
| 10.731072005455255 | 45.123 |
| 10.748271038453058 | 45.036 |
| 10.765488709812741 | 44.948 |
| 10.782725053328983 | 44.861 |
| 10.799980102919532 | 44.774 |
| 10.817253892625885 | 44.687 |
| 10.834546456613971 | 44.6 |
| 10.851857829174834 | 44.512 |
| 10.869188044725332 | 44.425 |
| 10.886537137808828 | 44.338 |
| 10.903905143095898 | 44.251 |
| 10.921292095385034 | 44.164 |
| 10.938698029603362 | 44.076 |
| 10.956122980807356 | 43.989 |
| 10.973566984183567 | 43.902 |
| 10.991030075049347 | 43.815 |
| 11.008512288853586 | 43.728 |
| 11.026013661177455 | 43.641 |
| 11.04353422773515 | 43.554 |
| 11.06107402437464 | 43.466 |
| 11.078633087078433 | 43.379 |
| 11.09621145196433 | 43.292 |
| 11.113809155286196 | 43.205 |
| 11.131426233434741 | 43.118 |
| 11.149062722938295 | 43.031 |
| 11.166718660463593 | 42.944 |
| 11.184394082816572 | 42.857 |
| 11.20208902694317 | 42.769 |
| 11.219803529930125 | 42.682 |
| 11.237537629005795 | 42.595 |
| 11.255291361540966 | 42.508 |
| 11.273064765049682 | 42.421 |
| 11.290857877190074 | 42.334 |
| 11.308670735765196 | 42.247 |
| 11.326503378723865 | 42.16 |
| 11.344355844161518 | 42.073 |
| 11.362228170321059 | 41.986 |
| 11.38012039559373 | 41.899 |
| 11.398032558519978 | 41.811 |
| 11.41596469779033 | 41.724 |
| 11.433916852246277 | 41.637 |
| 11.451889060881166 | 41.55 |
| 11.469881362841098 | 41.463 |
| 11.48789379742583 | 41.376 |
| 11.505926404089687 | 41.289 |
| 11.523979222442483 | 41.202 |
| 11.54205229225045 | 41.115 |
| 11.560145653437164 | 41.028 |
| 11.578259346084497 | 40.941 |
| 11.596393410433553 | 40.854 |
| 11.614547886885635 | 40.767 |
| 11.632722816003206 | 40.68 |
| 11.650918238510858 | 40.593 |
| 11.669134195296298 | 40.506 |
| 11.687370727411329 | 40.419 |
| 11.705627876072853 | 40.332 |
| 11.723905682663867 | 40.245 |
| 11.742204188734481 | 40.158 |
| 11.760523436002938 | 40.071 |
| 11.778863466356638 | 39.984 |
| 11.797224321853184 | 39.897 |
| 11.815606044721418 | 39.81 |
| 11.834008677362482 | 39.723 |
| 11.852432262350876 | 39.636 |
| 11.870876842435537 | 39.549 |
| 11.889342460540913 | 39.462 |
| 11.907829159768056 | 39.375 |
| 11.926336983395721 | 39.288 |
| 11.944865974881475 | 39.201 |
| 11.963416177862808 | 39.115 |
| 11.981987636158268 | 39.028 |
| 12.00058039376859 | 38.941 |
| 12.01919449487785 | 38.854 |
| 12.037829983854612 | 38.767 |
| 12.056486905253099 | 38.68 |
| 12.075165303814362 | 38.593 |
| 12.093865224467473 | 38.506 |
| 12.112586712330714 | 38.419 |
| 12.131329812712783 | 38.332 |
| 12.150094571114014 | 38.245 |
| 12.168881033227596 | 38.159 |
| 12.187689244940815 | 38.072 |
| 12.2065192523363 | 37.985 |
| 12.225371101693279 | 37.898 |
| 12.24424483948885 | 37.811 |
| 12.26314051239926 | 37.724 |
| 12.282058167301196 | 37.637 |
| 12.300997851273086 | 37.551 |
| 12.319959611596415 | 37.464 |
| 12.338943495757047 | 37.377 |
| 12.357949551446563 | 37.29 |
| 12.37697782656361 | 37.203 |
| 12.396028369215262 | 37.116 |
| 12.415101227718388 | 37.03 |
| 12.43419645060104 | 36.943 |
| 12.453314086603847 | 36.856 |
| 12.472454184681428 | 36.769 |
| 12.49161679400381 | 36.682 |
| 12.510801963957864 | 36.596 |
| 12.530009744148746 | 36.509 |
| 12.549240184401368 | 36.422 |
| 12.568493334761861 | 36.335 |
| 12.587769245499068 | 36.248 |
| 12.607067967106039 | 36.162 |
| 12.626389550301546 | 36.075 |
| 12.645734046031611 | 35.988 |
| 12.665101505471048 | 35.901 |
| 12.684491980025012 | 35.815 |
| 12.703905521330572 | 35.728 |
| 12.723342181258298 | 35.641 |
| 12.74280201191385 | 35.554 |
| 12.7622850656396 | 35.468 |
| 12.781791395016253 | 35.381 |
| 12.801321052864491 | 35.294 |
| 12.820874092246635 | 35.208 |
| 12.84045056646831 | 35.121 |
| 12.860050529080137 | 35.034 |
| 12.879674033879443 | 34.947 |
| 12.899321134911974 | 34.861 |
| 12.91899188647363 | 34.774 |
| 12.938686343112229 | 34.687 |
| 12.95840455962926 | 34.601 |
| 12.978146591081684 | 34.514 |
| 12.997912492783724 | 34.427 |
| 13.017702320308697 | 34.341 |
| 13.037516129490838 | 34.254 |
| 13.057353976427166 | 34.167 |
| 13.077215917479348 | 34.081 |
| 13.097102009275597 | 33.994 |
| 13.11701230871257 | 33.908 |
| 13.136946872957303 | 33.821 |
| 13.156905759449156 | 33.734 |
| 13.17688902590177 | 33.648 |
| 13.19689673030506 | 33.561 |
| 13.216928930927205 | 33.474 |
| 13.236985686316682 | 33.388 |
| 13.257067055304299 | 33.301 |
| 13.27717309700526 | 33.215 |
| 13.297303870821247 | 33.128 |
| 13.317459436442519 | 33.042 |
| 13.337639853850039 | 32.955 |
| 13.357845183317613 | 32.868 |
| 13.37807548541406 | 32.782 |
| 13.398330821005395 | 32.695 |
| 13.418611251257039 | 32.609 |
| 13.438916837636048 | 32.522 |
| 13.459247641913368 | 32.436 |
| 13.479603726166106 | 32.349 |
| 13.499985152779832 | 32.263 |
| 13.5203919844509 | 32.176 |
| 13.540824284188789 | 32.09 |
| 13.561282115318475 | 32.003 |
| 13.581765541482826 | 31.917 |
| 13.602274626645011 | 31.83 |
| 13.62280943509095 | 31.744 |
| 13.643370031431774 | 31.657 |
| 13.66395648060632 | 31.571 |
| 13.68456884788365 | 31.484 |
| 13.705207198865592 | 31.398 |
| 13.725871599489311 | 31.311 |
| 13.746562116029905 | 31.225 |
| 13.767278815103028 | 31.138 |
| 13.788021763667544 | 31.052 |
| 13.808791029028203 | 30.966 |
| 13.829586678838346 | 30.879 |
| 13.850408781102644 | 30.793 |
| 13.87125740417986 | 30.706 |
| 13.892132616785641 | 30.62 |
| 13.913034487995345 | 30.534 |
| 13.933963087246891 | 30.447 |
| 13.954918484343638 | 30.361 |
| 13.97590074945731 | 30.274 |
| 13.99690995313093 | 30.188 |
| 14.017946166281801 | 30.102 |
| 14.039009460204518 | 30.015 |
| 14.060099906574008 | 29.929 |
| 14.081217577448598 | 29.843 |
| 14.102362545273133 | 29.756 |
| 14.12353488288211 | 29.67 |
| 14.14473466350286 | 29.584 |
| 14.16596196075875 | 29.497 |
| 14.187216848672438 | 29.411 |
| 14.208499401669151 | 29.325 |
| 14.229809694580002 | 29.238 |
| 14.251147802645345 | 29.152 |
| 14.27251380151817 | 29.066 |
| 14.293907767267527 | 28.98 |
| 14.315329776382002 | 28.893 |
| 14.336779905773218 | 28.807 |
| 14.35825823277938 | 28.721 |
| 14.37976483516887 | 28.634 |
| 14.401299791143863 | 28.548 |
| 14.422863179344 | 28.462 |
| 14.4444550788501 | 28.376 |
| 14.466075569187906 | 28.29 |
| 14.487724730331887 | 28.203 |
| 14.509402642709071 | 28.117 |
| 14.531109387202928 | 28.031 |
| 14.552845045157296 | 27.945 |
| 14.574609698380359 | 27.859 |
| 14.596403429148658 | 27.772 |
| 14.618226320211164 | 27.686 |
| 14.640078454793384 | 27.6 |
| 14.661959916601528 | 27.514 |
| 14.683870789826713 | 27.428 |
| 14.705811159149226 | 27.342 |
| 14.727781109742834 | 27.255 |
| 14.749780727279143 | 27.169 |
| 14.77181009793201 | 27.083 |
| 14.793869308382009 | 26.997 |
| 14.81595844582095 | 26.911 |
| 14.838077597956449 | 26.825 |
| 14.860226853016561 | 26.739 |
| 14.882406299754457 | 26.653 |
| 14.904616027453166 | 26.567 |
| 14.926856125930376 | 26.481 |
| 14.949126685543286 | 26.395 |
| 14.971427797193522 | 26.309 |
| 14.993759552332113 | 26.223 |
| 15.01612204296453 | 26.136 |
| 15.038515361655781 | 26.05 |
| 15.060939601535571 | 25.964 |
| 15.083394856303533 | 25.878 |
| 15.105881220234519 | 25.792 |
| 15.12839878818395 | 25.706 |
| 15.150947655593248 | 25.62 |
| 15.17352791849532 | 25.535 |
| 15.196139673520129 | 25.449 |
| 15.218783017900316 | 25.363 |
| 15.241458049476908 | 25.277 |
| 15.264164866705093 | 25.191 |
| 15.286903568660069 | 25.105 |
| 15.30967425504297 | 25.019 |
| 15.332477026186861 | 24.933 |
| 15.355311983062824 | 24.847 |
| 15.378179227286106 | 24.761 |
| 15.40107886112236 | 24.675 |
| 15.424010987493961 | 24.589 |
| 15.44697570998641 | 24.503 |
| 15.46997313285481 | 24.418 |
| 15.493003361030441 | 24.332 |
| 15.516066500127415 | 24.246 |
| 15.539162656449419 | 24.16 |
| 15.562291936996548 | 24.074 |
| 15.585454449472232 | 23.988 |
| 15.608650302290252 | 23.903 |
| 15.631879604581849 | 23.817 |
| 15.655142466202937 | 23.731 |
| 15.6784389977414 | 23.645 |
| 15.701769310524506 | 23.559 |
| 15.7251335166264 | 23.474 |
| 15.748531728875717 | 23.388 |
| 15.771964060863295 | 23.302 |
| 15.795430626949988 | 23.216 |
| 15.818931542274594 | 23.131 |
| 15.842466922761888 | 23.045 |
| 15.86603688513077 | 22.959 |
| 15.88964154690252 | 22.874 |
| 15.913281026409186 | 22.788 |
| 15.936955442802061 | 22.702 |
| 15.96066491606031 | 22.617 |
| 15.984409566999696 | 22.531 |
| 16.008189517281444 | 22.445 |
| 16.032004889421227 | 22.36 |
| 16.05585580679827 | 22.274 |
| 16.07974239366461 | 22.188 |
| 16.103664775154456 | 22.103 |
| 16.127623077293723 | 22.017 |
| 16.151617427009665 | 21.932 |
| 16.175647952140675 | 21.846 |
| 16.19971478144622 | 21.76 |
| 16.223818044616923 | 21.675 |
| 16.247957872284786 | 21.589 |
| 16.272134396033582 | 21.504 |
| 16.29634774840938 | 21.418 |
| 16.320598062931243 | 21.333 |
| 16.34488547410207 | 21.247 |
| 16.369210117419627 | 21.162 |
| 16.39357212938771 | 21.076 |
| 16.417971647527512 | 20.991 |
| 16.44240881038913 | 20.905 |
| 16.46688375756327 | 20.82 |
| 16.491396629693128 | 20.734 |
| 16.51594756848644 | 20.649 |
| 16.540536716727733 | 20.564 |
| 16.56516421829076 | 20.478 |
| 16.58983021815113 | 20.393 |
| 16.614534862399125 | 20.307 |
| 16.639278298252744 | 20.222 |
| 16.664060674070917 | 20.137 |
| 16.688882139366953 | 20.051 |
| 16.713742844822193 | 19.966 |
| 16.738642942299887 | 19.881 |
| 16.76358258485928 | 19.795 |
| 16.788561926769933 | 19.71 |
| 16.813581123526276 | 19.625 |
| 16.838640331862393 | 19.539 |
| 16.863739709767053 | 19.454 |
| 16.888879416498966 | 19.369 |
| 16.91405961260233 | 19.284 |
| 16.939280459922585 | 19.198 |
| 16.964542121622472 | 19.113 |
| 16.989844762198317 | 19.028 |
| 17.015188547496628 | 18.943 |
| 17.040573644730937 | 18.858 |
| 17.066000222498946 | 18.772 |
| 17.09146845079994 | 18.687 |
| 17.11697850105253 | 18.602 |
| 17.14253054611266 | 18.517 |
| 17.168124760291953 | 18.432 |
| 17.19376131937635 | 18.347 |
| 17.219440400645087 | 18.262 |
| 17.24516218288999 | 18.177 |
| 17.270926846435117 | 18.091 |
| 17.296734573156723 | 18.006 |
| 17.322585546503603 | 17.921 |
| 17.348479951517774 | 17.836 |
| 17.374417974855533 | 17.751 |
| 17.400399804808888 | 17.666 |
| 17.42642563132737 | 17.581 |
| 17.452495646040234 | 17.496 |
| 17.478610042279076 | 17.411 |
| 17.504769015100848 | 17.326 |
| 17.530972761311286 | 17.241 |
| 17.55722147948878 | 17.157 |
| 17.58351537000869 | 17.072 |
| 17.609854635068075 | 16.987 |
| 17.636239478710934 | 16.902 |
| 17.662670106853867 | 16.817 |
| 17.68914672731226 | 16.732 |
| 17.715669549826924 | 16.647 |
| 17.742238786091278 | 16.562 |
| 17.768854649779012 | 16.478 |
| 17.795517356572308 | 16.393 |
| 17.822227124190583 | 16.308 |
| 17.848984172419797 | 16.223 |
| 17.87578872314233 | 16.139 |
| 17.902641000367428 | 16.054 |
| 17.929541230262277 | 15.969 |
| 17.956489641183644 | 15.884 |
| 17.983486463710186 | 15.8 |
| 18.010531930675374 | 15.715 |
| 18.037626277201092 | 15.63 |
| 18.064769740731897 | 15.546 |
| 18.091962561069987 | 15.461 |
| 18.11920498041086 | 15.377 |
| 18.14649724337972 | 15.292 |
| 18.17383959706862 | 15.207 |
| 18.201232291074373 | 15.123 |
| 18.22867557753723 | 15.038 |
| 18.25616971118042 | 14.954 |
| 18.283714949350443 | 14.869 |
| 18.311311552058275 | 14.785 |
| 18.33895978202141 | 14.7 |
| 18.366659904706808 | 14.616 |
| 18.394412188374773 | 14.531 |
| 18.42221690412375 | 14.447 |
| 18.450074325936125 | 14.362 |
| 18.477984730724994 | 14.278 |
| 18.50594839838197 | 14.194 |
| 18.53396561182604 | 14.109 |
| 18.562036657053508 | 14.025 |
| 18.590161823189035 | 13.941 |
| 18.618341402537848 | 13.856 |
| 18.64657569063909 | 13.772 |
| 18.674864986320422 | 13.688 |
| 18.70320959175383 | 13.604 |
| 18.731609812512726 | 13.519 |
| 18.760065957630378 | 13.435 |
| 18.788578339659676 | 13.351 |
| 18.817147274734303 | 13.267 |
| 18.845773082631336 | 13.183 |
| 18.87445608683533 | 13.098 |
| 18.903196614603928 | 13.014 |
| 18.93199499703502 | 12.93 |
| 18.960851569135546 | 12.846 |
| 18.989766669891942 | 12.762 |
| 19.01874064234231 | 12.678 |
| 19.04777383365035 | 12.594 |
| 19.07686659518113 | 12.51 |
| 19.106019282578714 | 12.426 |
| 19.135232255845743 | 12.342 |
| 19.164505879425022 | 12.258 |
| 19.193840522283146 | 12.174 |
| 19.223236557996284 | 12.09 |
| 19.252694364838142 | 12.007 |
| 19.282214325870203 | 11.923 |
| 19.311796829034307 | 11.839 |
| 19.341442267247654 | 11.755 |
| 19.371151038500305 | 11.671 |
| 19.400923545955262 | 11.588 |
| 19.430760198051235 | 11.504 |
| 19.460661408608143 | 11.42 |
| 19.490627596935493 | 11.336 |
| 19.520659187943693 | 11.253 |
| 19.55075661225843 | 11.169 |
| 19.580920306338193 | 11.086 |
| 19.611150712595084 | 11.002 |
| 19.641448279519 | 10.918 |
| 19.67181346180532 | 10.835 |
| 19.70224672048623 | 10.751 |
| 19.732748523065784 | 10.668 |
| 19.763319343658907 | 10.584 |
| 19.793959663134384 | 10.501 |
| 19.824669969262075 | 10.418 |
| 19.85545075686445 | 10.334 |
| 19.886302527972635 | 10.251 |
| 19.917225791987136 | 10.167 |
| 19.948221065843402 | 10.084 |
| 19.979288874182448 | 10.001 |
| 20.01042974952667 | 9.918 |
| 20.041644232461127 | 9.834 |
| 20.072932871820463 | 9.751 |
| 20.104296224881676 | 9.668 |
| 20.13573485756301 | 9.585 |
| 20.167249344629187 | 9.502 |
| 20.198840269903247 | 9.419 |
| 20.230508226485238 | 9.336 |
| 20.2622538169781 | 9.253 |
| 20.294077653720954 | 9.17 |
| 20.32598035903019 | 9.087 |
| 20.357962565448624 | 9.004 |
| 20.390024916003096 | 8.921 |
| 20.422168064470863 | 8.838 |
| 20.454392675655164 | 8.755 |
| 20.48669942567037 | 8.672 |
| 20.51908900223712 | 8.589 |
| 20.551562104987912 | 8.507 |
| 20.584119445783603 | 8.424 |
| 20.616761749041306 | 8.341 |
| 20.649489752074217 | 8.259 |
| 20.68230420544394 | 8.176 |
| 20.715205873325836 | 8.093 |
| 20.74819553388807 | 8.011 |
| 20.78127397968496 | 7.928 |
| 20.814442018065368 | 7.846 |
| 20.847700471596777 | 7.764 |
| 20.881050178505916 | 7.681 |
| 20.914491993136682 | 7.599 |
| 20.94802678642625 | 7.516 |
| 20.98165544640029 | 7.434 |
| 21.015378878688246 | 7.352 |
| 21.049198007059736 | 7.27 |
| 21.083113773983147 | 7.188 |
| 21.117127141207607 | 7.105 |
| 21.151239090369575 | 7.023 |
| 21.185450623625364 | 6.941 |
| 21.219762764311017 | 6.859 |
| 21.254176557631034 | 6.777 |
| 21.28869307137754 | 6.695 |
| 21.323313396681648 | 6.614 |
| 21.358038648798786 | 6.532 |
| 21.392869967929993 | 6.45 |
| 21.427808520081264 | 6.368 |
| 21.462855497963165 | 6.287 |
| 21.498012121933154 | 6.205 |
| 21.533279640983167 | 6.123 |
| 21.568659333775226 | 6.042 |
| 21.604152509728085 | 5.96 |
| 21.63976051015805 | 5.879 |
| 21.67548470947749 | 5.797 |
| 21.711326516454672 | 5.716 |
| 21.747287375538995 | 5.635 |
| 21.783368768255897 | 5.554 |
| 21.819572214676118 | 5.472 |
| 21.85589927496438 | 5.391 |
| 21.892351551012943 | 5.31 |
| 21.928930688165988 | 5.229 |
| 21.96563837704123 | 5.148 |
| 22.002476355455823 | 5.067 |
| 22.039446410464087 | 4.986 |
| 22.07655038051544 | 4.906 |
| 22.1137901577415 | 4.825 |
| 22.15116769038232 | 4.744 |
| 22.188684985362457 | 4.664 |
| 22.22634411102883 | 4.583 |
| 22.26414720006324 | 4.503 |
| 22.302096452583857 | 4.422 |
| 22.340194139451363 | 4.342 |
| 22.37844260579697 | 4.262 |
| 22.416844274791437 | 4.182 |
| 22.45540165167611 | 4.102 |
| 22.49411732807933 | 4.022 |
| 22.532993986644108 | 3.942 |
| 22.572034405995794 | 3.862 |
| 22.611241466081783 | 3.782 |
| 22.650618153919016 | 3.702 |
| 22.6901675697892 | 3.623 |
| 22.729892933926518 | 3.543 |
| 22.769797593748137 | 3.464 |
| 22.80988503168408 | 3.384 |
| 22.85015887367036 | 3.305 |
| 22.8906228983776 | 3.226 |
| 22.931281047257134 | 3.147 |
| 22.97213743549776 | 3.068 |
| 23.013196363999576 | 2.989 |
| 23.0544623324865 | 2.911 |
| 23.095940053897227 | 2.832 |
| 23.137634470215424 | 2.753 |
| 23.17955076992516 | 2.675 |
| 23.221694407307176 | 2.597 |
| 23.264071123827133 | 2.519 |
| 23.306686971909492 | 2.441 |
| 23.349548341441782 | 2.363 |
| 23.392661989415977 | 2.285 |
| 23.436035073189025 | 2.207 |
| 23.47967518793679 | 2.13 |
| 23.523590408989303 | 2.053 |
| 23.567789339875873 | 1.976 |
| 23.612281167084557 | 1.899 |
| 23.657075722761352 | 1.822 |
| 23.70218355685478 | 1.745 |
| 23.74761602056984 | 1.669 |
| 23.79338536345757 | 1.593 |
| 23.839504847069186 | 1.517 |
| 23.88598887889742 | 1.441 |
| 23.93285317138584 | 1.365 |
| 23.980114932214818 | 1.29 |
| 24.027793094027412 | 1.215 |
| 24.075908594474274 | 1.14 |
| 24.124484721294618 | 1.066 |
| 24.173547542675692 | 0.992 |
| 24.223126451254657 | 0.918 |
| 24.27325486234573 | 0.845 |
| 24.323971125850274 | 0.772 |
| 24.375319741353 | 0.699 |
| 24.427353015420888 | 0.627 |
| 24.480133385075344 | 0.555 |
| 24.533736784283963 | 0.485 |
| 24.58825772161517 | 0.414 |
| 24.64381733254411 | 0.345 |
| 24.70057699871675 | 0.277 |
| 24.758763452685223 | 0.209 |
| 24.818721023223652 | 0.144 |
| 24.881042550391392 | 0.08 |
| 24.947024871316806 | 0.021 |
| 25.02226895530109 | -0.027 |